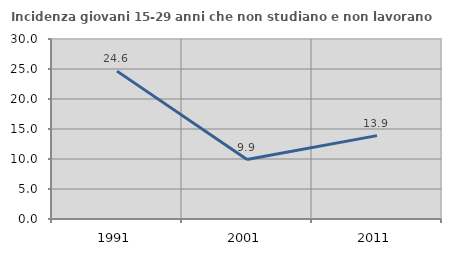
| Category | Incidenza giovani 15-29 anni che non studiano e non lavorano  |
|---|---|
| 1991.0 | 24.645 |
| 2001.0 | 9.906 |
| 2011.0 | 13.897 |